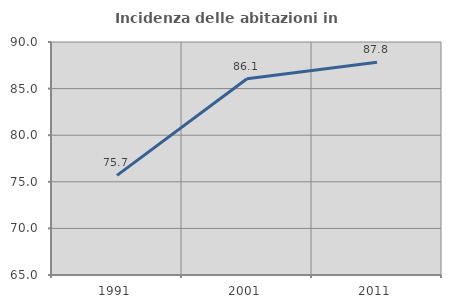
| Category | Incidenza delle abitazioni in proprietà  |
|---|---|
| 1991.0 | 75.692 |
| 2001.0 | 86.062 |
| 2011.0 | 87.827 |